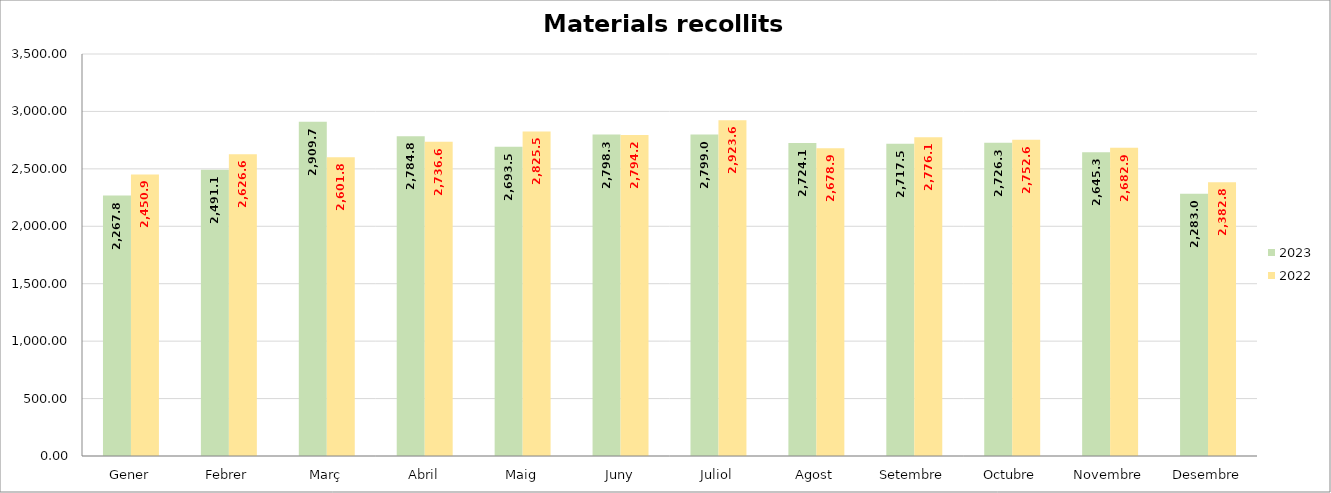
| Category | 2023 | 2022 |
|---|---|---|
| Gener | 2267.861 | 2450.973 |
| Febrer | 2491.17 | 2626.691 |
| Març | 2909.728 | 2601.82 |
| Abril | 2784.853 | 2736.664 |
| Maig | 2693.539 | 2825.502 |
| Juny | 2798.382 | 2794.26 |
| Juliol | 2799.085 | 2923.684 |
| Agost | 2724.1 | 2678.994 |
| Setembre | 2717.51 | 2776.129 |
| Octubre | 2726.391 | 2752.669 |
| Novembre | 2645.34 | 2682.927 |
| Desembre | 2283.057 | 2382.797 |